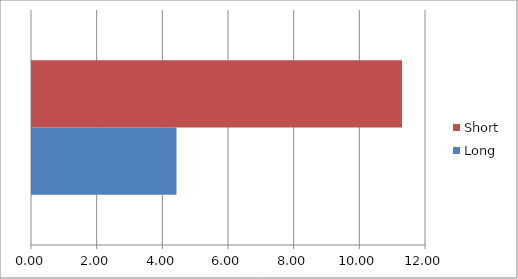
| Category | Long | Short |
|---|---|---|
| 0 | 4.4 | 11.27 |